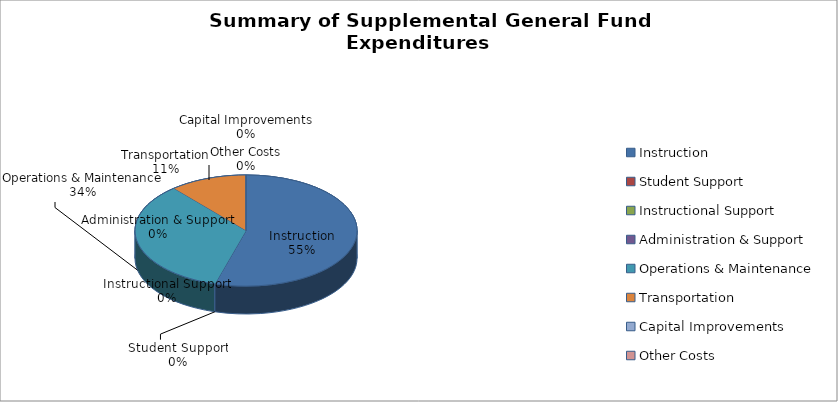
| Category | 2018-2019 |
|---|---|
| Instruction | 251582 |
| Student Support | 0 |
| Instructional Support | 0 |
| Administration & Support | 0 |
| Operations & Maintenance | 157950 |
| Transportation | 51900 |
| Capital Improvements | 0 |
| Other Costs | 0 |